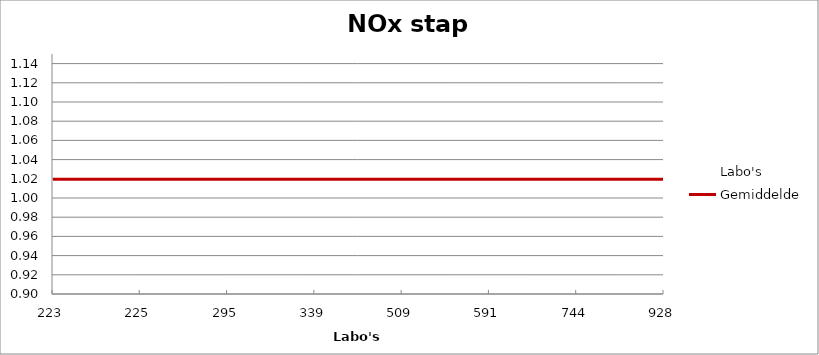
| Category | Labo's | Gemiddelde |
|---|---|---|
| 223.0 | 1.031 | 1.02 |
| 225.0 | 1 | 1.02 |
| 295.0 | 0.9 | 1.02 |
| 339.0 | 1.035 | 1.02 |
| 509.0 | 1.03 | 1.02 |
| 591.0 | 1.045 | 1.02 |
| 744.0 | 0.977 | 1.02 |
| 928.0 | 1.145 | 1.02 |